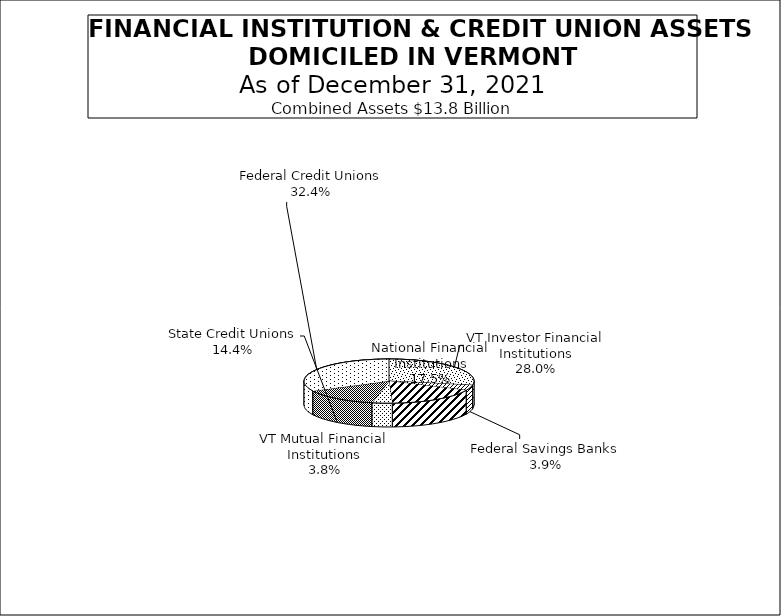
| Category | Data A |
|---|---|
| VT Investor Financial Institutions | 3868397 |
| Federal Savings Banks | 542859 |
| National Financial Institutions | 2421312 |
| VT Mutual Financial Institutions | 525641 |
| State Credit Unions | 1998811 |
| Federal Credit Unions | 4477827 |